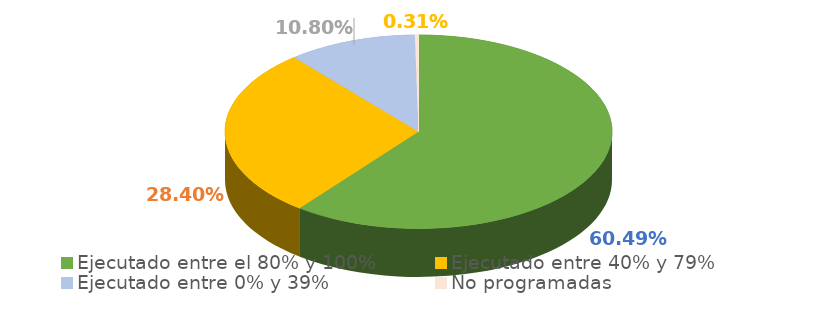
| Category | Series 0 |
|---|---|
| Ejecutado entre el 80% y 100% | 0.605 |
| Ejecutado entre 40% y 79% | 0.284 |
| Ejecutado entre 0% y 39% | 0.108 |
| No programadas | 0.003 |